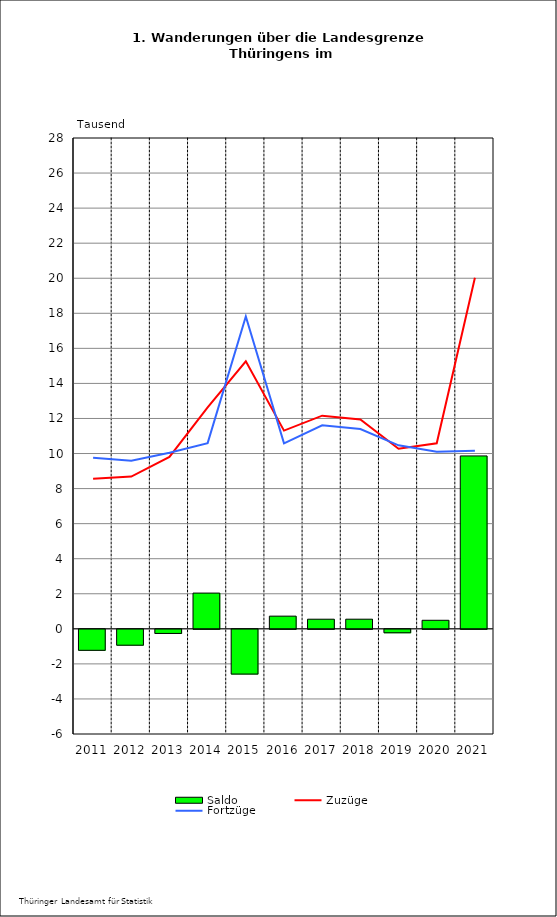
| Category | Saldo |
|---|---|
| 2011.0 | -1.198 |
| 2012.0 | -0.906 |
| 2013.0 | -0.235 |
| 2014.0 | 2.039 |
| 2015.0 | -2.554 |
| 2016.0 | 0.723 |
| 2017.0 | 0.548 |
| 2018.0 | 0.549 |
| 2019.0 | -0.197 |
| 2020.0 | 0.487 |
| 2021.0 | 9.863 |